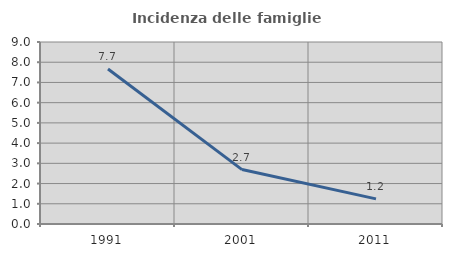
| Category | Incidenza delle famiglie numerose |
|---|---|
| 1991.0 | 7.666 |
| 2001.0 | 2.691 |
| 2011.0 | 1.244 |